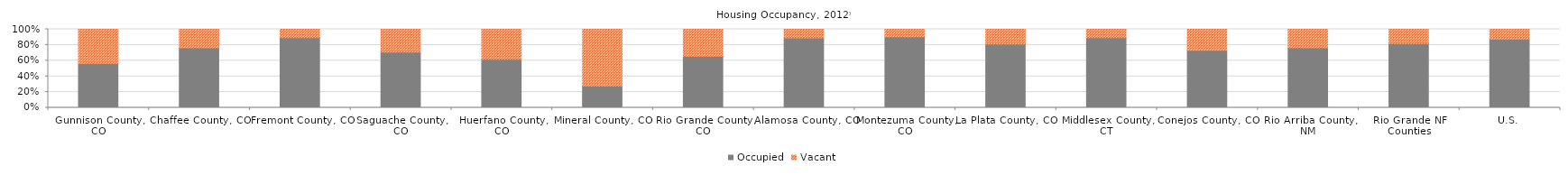
| Category | Occupied | Vacant |
|---|---|---|
| Gallatin County, MT | 0.869 | 0.131 |
| County Region | 0.869 | 0.131 |
| U.S. | 0.875 | 0.125 |